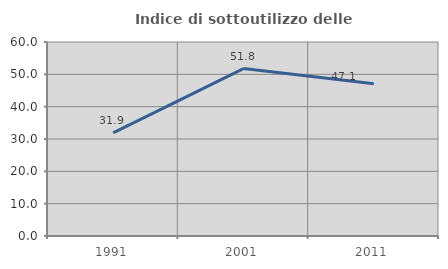
| Category | Indice di sottoutilizzo delle abitazioni  |
|---|---|
| 1991.0 | 31.868 |
| 2001.0 | 51.78 |
| 2011.0 | 47.101 |